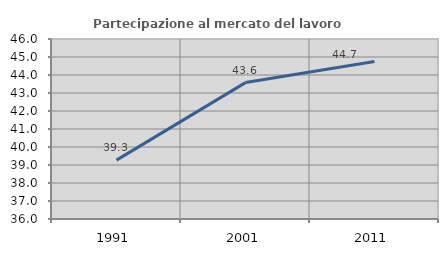
| Category | Partecipazione al mercato del lavoro  femminile |
|---|---|
| 1991.0 | 39.273 |
| 2001.0 | 43.578 |
| 2011.0 | 44.748 |